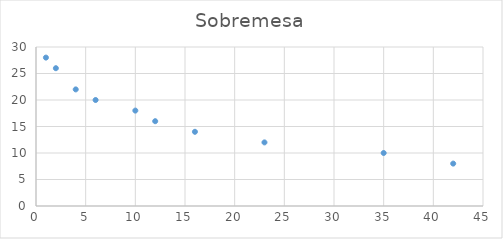
| Category | Sobremesa |
|---|---|
| 42.0 | 8 |
| 35.0 | 10 |
| 23.0 | 12 |
| 16.0 | 14 |
| 12.0 | 16 |
| 10.0 | 18 |
| 6.0 | 20 |
| 4.0 | 22 |
| 2.0 | 26 |
| 1.0 | 28 |